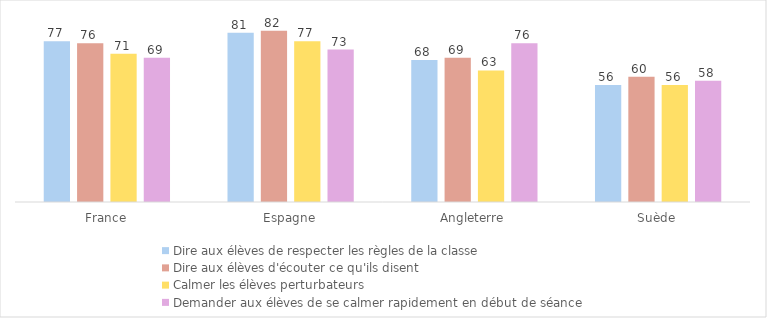
| Category | Dire aux élèves de respecter les règles de la classe | Dire aux élèves d'écouter ce qu'ils disent | Calmer les élèves perturbateurs | Demander aux élèves de se calmer rapidement en début de séance |
|---|---|---|---|---|
| France | 77 | 76 | 71 | 69 |
| Espagne | 81 | 82 | 77 | 73 |
| Angleterre | 68 | 69 | 63 | 76 |
| Suède | 56 | 60 | 56 | 58 |